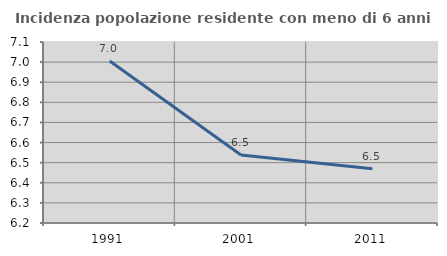
| Category | Incidenza popolazione residente con meno di 6 anni |
|---|---|
| 1991.0 | 7.005 |
| 2001.0 | 6.538 |
| 2011.0 | 6.469 |